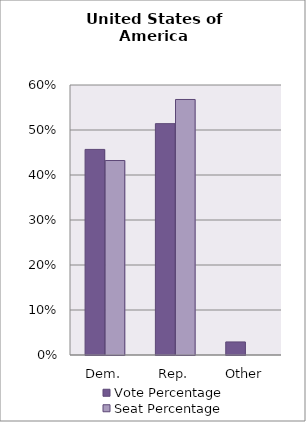
| Category | Vote Percentage | Seat Percentage |
|---|---|---|
| 0 | 0.457 | 0.432 |
| 1 | 0.514 | 0.568 |
| 2 | 0.029 | 0 |